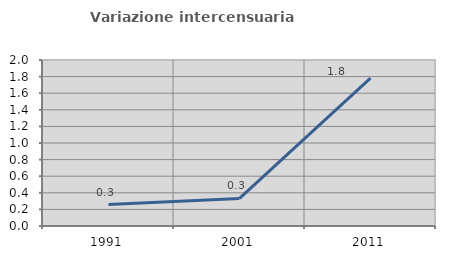
| Category | Variazione intercensuaria annua |
|---|---|
| 1991.0 | 0.258 |
| 2001.0 | 0.332 |
| 2011.0 | 1.782 |